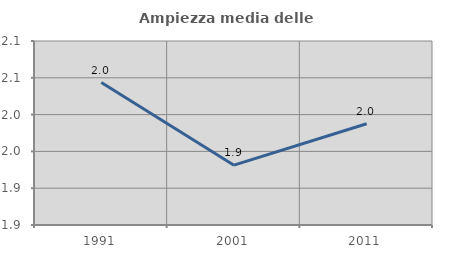
| Category | Ampiezza media delle famiglie |
|---|---|
| 1991.0 | 2.043 |
| 2001.0 | 1.931 |
| 2011.0 | 1.988 |